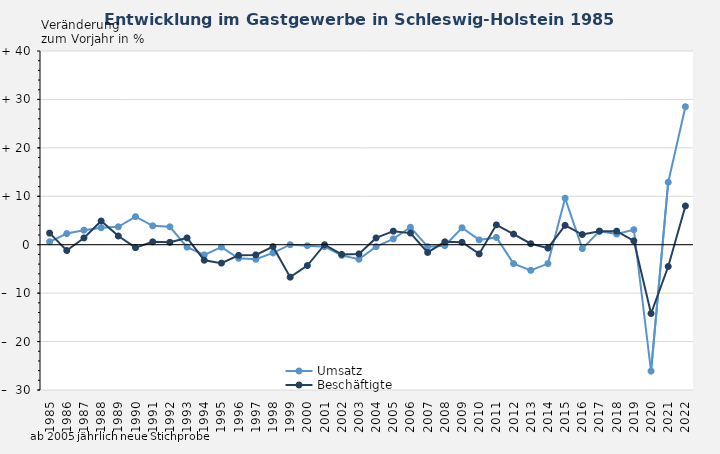
| Category | Umsatz | Beschäftigte |
|---|---|---|
| 1985.0 | 0.6 | 2.4 |
| 1986.0 | 2.3 | -1.2 |
| 1987.0 | 3 | 1.4 |
| 1988.0 | 3.5 | 4.9 |
| 1989.0 | 3.7 | 1.8 |
| 1990.0 | 5.8 | -0.6 |
| 1991.0 | 3.9 | 0.6 |
| 1992.0 | 3.7 | 0.5 |
| 1993.0 | -0.5 | 1.4 |
| 1994.0 | -2.1 | -3.2 |
| 1995.0 | -0.5 | -3.8 |
| 1996.0 | -2.8 | -2.2 |
| 1997.0 | -3 | -2.1 |
| 1998.0 | -1.7 | -0.4 |
| 1999.0 | 0 | -6.7 |
| 2000.0 | -0.2 | -4.3 |
| 2001.0 | -0.4 | 0 |
| 2002.0 | -2.2 | -2 |
| 2003.0 | -3 | -1.9 |
| 2004.0 | -0.4 | 1.4 |
| 2005.0 | 1.2 | 2.8 |
| 2006.0 | 3.6 | 2.4 |
| 2007.0 | -0.4 | -1.6 |
| 2008.0 | -0.2 | 0.6 |
| 2009.0 | 3.5 | 0.5 |
| 2010.0 | 1 | -1.9 |
| 2011.0 | 1.5 | 4.1 |
| 2012.0 | -3.9 | 2.2 |
| 2013.0 | -5.3 | 0.2 |
| 2014.0 | -3.9 | -0.7 |
| 2015.0 | 9.6 | 4 |
| 2016.0 | -0.8 | 2.1 |
| 2017.0 | 2.8 | 2.8 |
| 2018.0 | 2.2 | 2.8 |
| 2019.0 | 3.1 | 0.8 |
| 2020.0 | -26.1 | -14.2 |
| 2021.0 | 12.9 | -4.5 |
| 2022.0 | 28.5 | 8 |